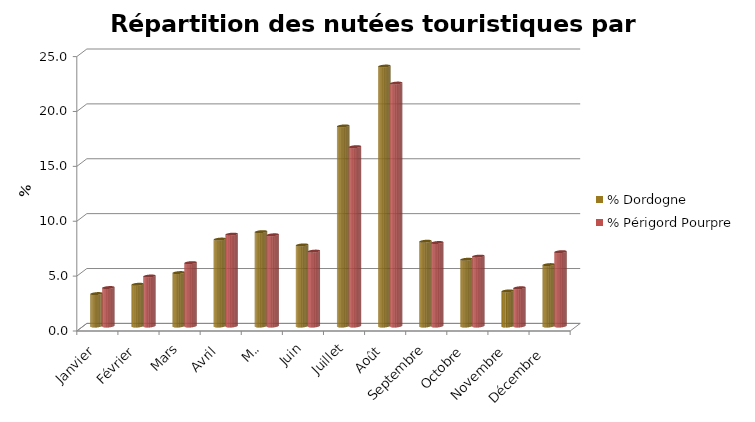
| Category | % Dordogne | % Périgord Pourpre |
|---|---|---|
| Janvier | 2.951 | 3.5 |
| Février | 3.8 | 4.552 |
| Mars | 4.864 | 5.77 |
| Avril | 7.917 | 8.365 |
| Mai | 8.594 | 8.308 |
| Juin | 7.386 | 6.82 |
| Juillet | 18.226 | 16.336 |
| Août | 23.679 | 22.129 |
| Septembre | 7.721 | 7.603 |
| Octobre | 6.08 | 6.364 |
| Novembre | 3.192 | 3.482 |
| Décembre  | 5.59 | 6.769 |